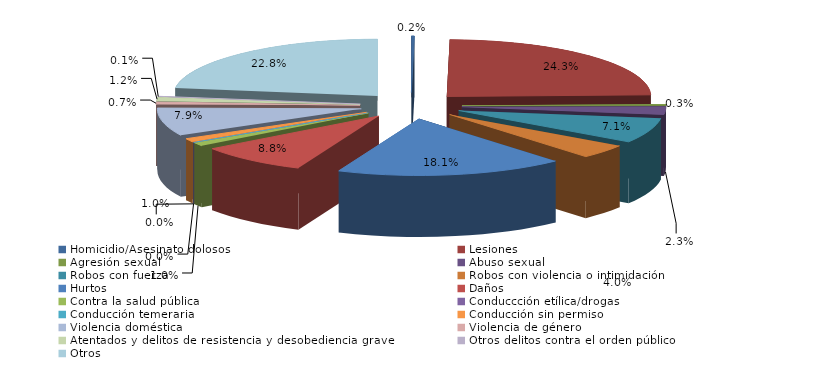
| Category | Series 0 |
|---|---|
| Homicidio/Asesinato dolosos | 2 |
| Lesiones | 211 |
| Agresión sexual | 3 |
| Abuso sexual | 20 |
| Robos con fuerza | 62 |
| Robos con violencia o intimidación | 35 |
| Hurtos | 157 |
| Daños | 76 |
| Contra la salud pública | 9 |
| Conduccción etílica/drogas | 0 |
| Conducción temeraria | 0 |
| Conducción sin permiso | 9 |
| Violencia doméstica | 69 |
| Violencia de género | 6 |
| Atentados y delitos de resistencia y desobediencia grave | 10 |
| Otros delitos contra el orden público | 1 |
| Otros | 198 |